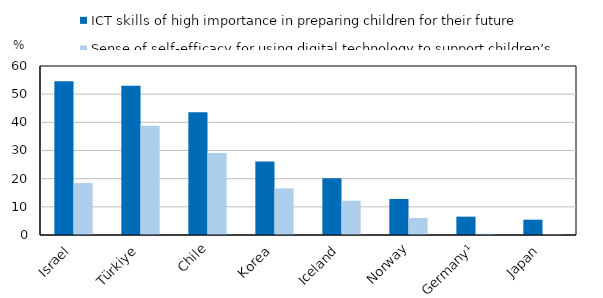
| Category | ICT skills of high importance in preparing children for their future  | Sense of self-efficacy for using digital technology to support children’s learning |
|---|---|---|
| Israel | 54.588 | 18.476 |
| Türkiye | 52.996 | 38.827 |
| Chile | 43.606 | 29.068 |
| Korea | 26.06 | 16.56 |
| Iceland | 20.145 | 12.16 |
| Norway | 12.784 | 6.021 |
| Germany¹ | 6.514 | 0.444 |
| Japan | 5.436 | 0.263 |